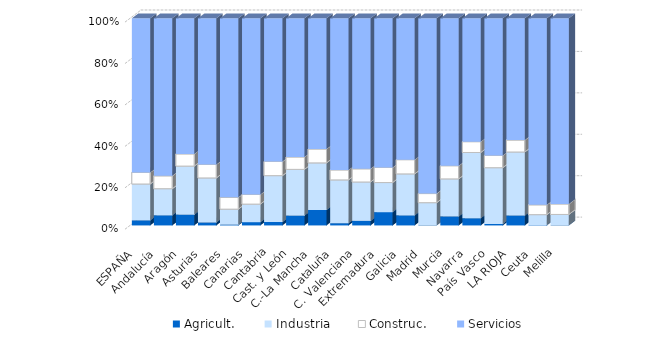
| Category | Agricult. | Industria | Construc. | Servicios |
|---|---|---|---|---|
| ESPAÑA | 2.492 | 17.519 | 5.561 | 74.428 |
| Andalucía | 4.907 | 12.822 | 6.204 | 76.067 |
| Aragón | 5.23 | 23.424 | 5.885 | 65.462 |
| Asturias | 1.45 | 21.479 | 6.5 | 70.571 |
| Baleares | 0.419 | 7.444 | 5.69 | 86.447 |
| Canarias | 1.609 | 8.692 | 4.679 | 85.02 |
| Cantabria | 1.67 | 22.371 | 6.823 | 69.136 |
| Cast. y León | 4.769 | 22.301 | 5.966 | 66.964 |
| C.-La Mancha | 7.457 | 22.738 | 6.701 | 63.104 |
| Cataluña | 1.094 | 20.886 | 4.817 | 73.202 |
| C. Valenciana | 2.205 | 18.779 | 6.341 | 72.675 |
| Extremadura | 6.43 | 14.276 | 7.26 | 72.034 |
| Galicia | 4.881 | 19.993 | 6.87 | 68.256 |
| Madrid | 0.088 | 10.901 | 4.393 | 84.618 |
| Murcia | 4.369 | 18.091 | 6.351 | 71.189 |
| Navarra | 3.5 | 31.718 | 5.223 | 59.559 |
| País Vasco | 0.736 | 27.131 | 5.904 | 66.229 |
| LA RIOJA | 4.853 | 30.61 | 5.771 | 58.767 |
| Ceuta | 0.181 | 5.029 | 4.734 | 90.056 |
| Melilla | 0.073 | 5.232 | 5.053 | 89.642 |